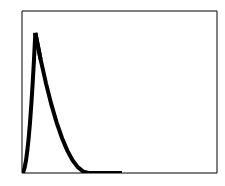
| Category | Series 0 |
|---|---|
| 0.00016666666666666666 | 0 |
| 2.3245334713960935 | 0.865 |
| 4.64890027612552 | 3.458 |
| 6.9732670808549475 | 7.78 |
| 9.297633885584373 | 13.831 |
| 11.6220006903138 | 21.611 |
| 13.946367495043228 | 31.12 |
| 16.270734299772656 | 42.358 |
| 18.59510110450208 | 55.324 |
| 20.91946790923151 | 70.02 |
| 23.243834713960936 | 86.444 |
| 23.243837899010217 | 86.444 |
| 23.2438410840595 | 86.444 |
| 23.24384426910878 | 86.444 |
| 23.243847454158065 | 86.444 |
| 23.243850639207345 | 86.444 |
| 23.24385382425663 | 86.444 |
| 23.24385700930591 | 86.444 |
| 23.243860194355193 | 86.444 |
| 23.243863379404477 | 86.444 |
| 23.243866564453757 | 86.444 |
| 32.54133378337146 | 70.02 |
| 41.83880100228917 | 55.324 |
| 51.13626822120688 | 42.358 |
| 60.433735440124586 | 31.12 |
| 69.7312026590423 | 21.611 |
| 79.02866987796 | 13.831 |
| 88.3261370968777 | 7.78 |
| 97.62360431579539 | 3.458 |
| 106.92107153471309 | 0.865 |
| 116.2185387536308 | 0 |
| 145.27317344203848 | 0 |
| 174.3278081304462 | 0 |